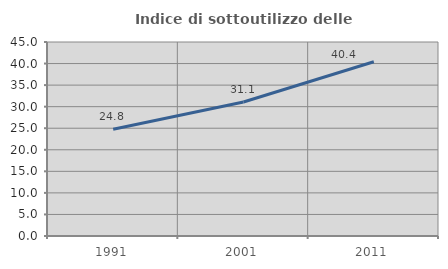
| Category | Indice di sottoutilizzo delle abitazioni  |
|---|---|
| 1991.0 | 24.776 |
| 2001.0 | 31.085 |
| 2011.0 | 40.42 |